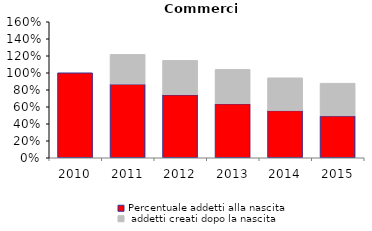
| Category | Percentuale addetti alla nascita | Percentuale addetti creati dopo la nascita |
|---|---|---|
| 2010.0 | 1 | 0 |
| 2011.0 | 0.868 | 0.348 |
| 2012.0 | 0.741 | 0.405 |
| 2013.0 | 0.636 | 0.403 |
| 2014.0 | 0.556 | 0.385 |
| 2015.0 | 0.493 | 0.385 |